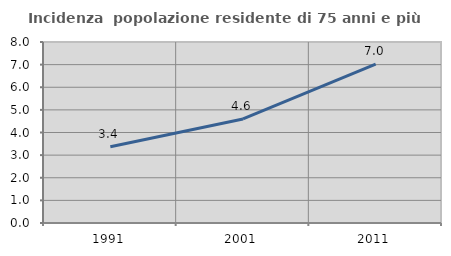
| Category | Incidenza  popolazione residente di 75 anni e più |
|---|---|
| 1991.0 | 3.367 |
| 2001.0 | 4.6 |
| 2011.0 | 7.021 |